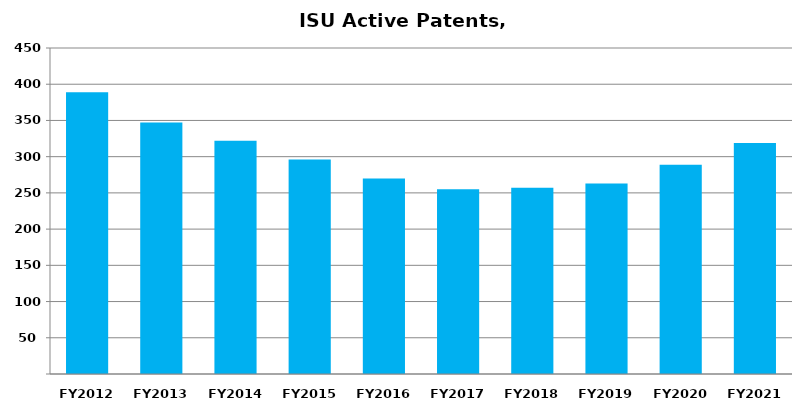
| Category | Active Patents |
|---|---|
| FY2012 | 389 |
| FY2013 | 347 |
| FY2014 | 322 |
| FY2015 | 296 |
| FY2016 | 270 |
| FY2017 | 255 |
| FY2018 | 257 |
| FY2019 | 263 |
| FY2020 | 289 |
| FY2021 | 319 |